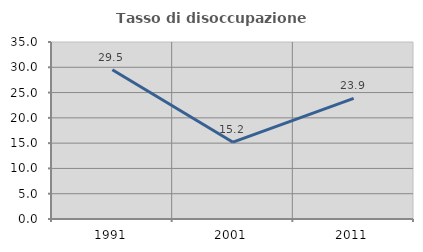
| Category | Tasso di disoccupazione giovanile  |
|---|---|
| 1991.0 | 29.518 |
| 2001.0 | 15.191 |
| 2011.0 | 23.855 |